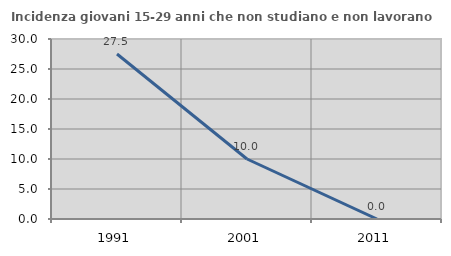
| Category | Incidenza giovani 15-29 anni che non studiano e non lavorano  |
|---|---|
| 1991.0 | 27.5 |
| 2001.0 | 10 |
| 2011.0 | 0 |